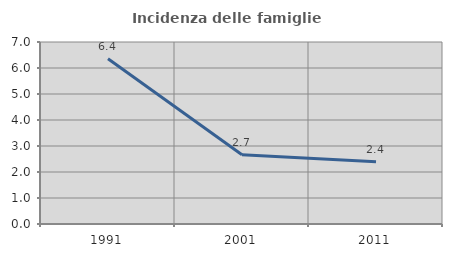
| Category | Incidenza delle famiglie numerose |
|---|---|
| 1991.0 | 6.352 |
| 2001.0 | 2.665 |
| 2011.0 | 2.391 |